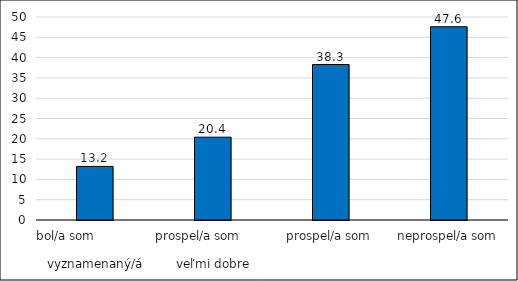
| Category | Series 0 |
|---|---|
| bol/a som                              vyznamenaný/á | 13.2 |
| prospel/a som                                veľmi dobre | 20.4 |
| prospel/a som | 38.3 |
| neprospel/a som | 47.6 |